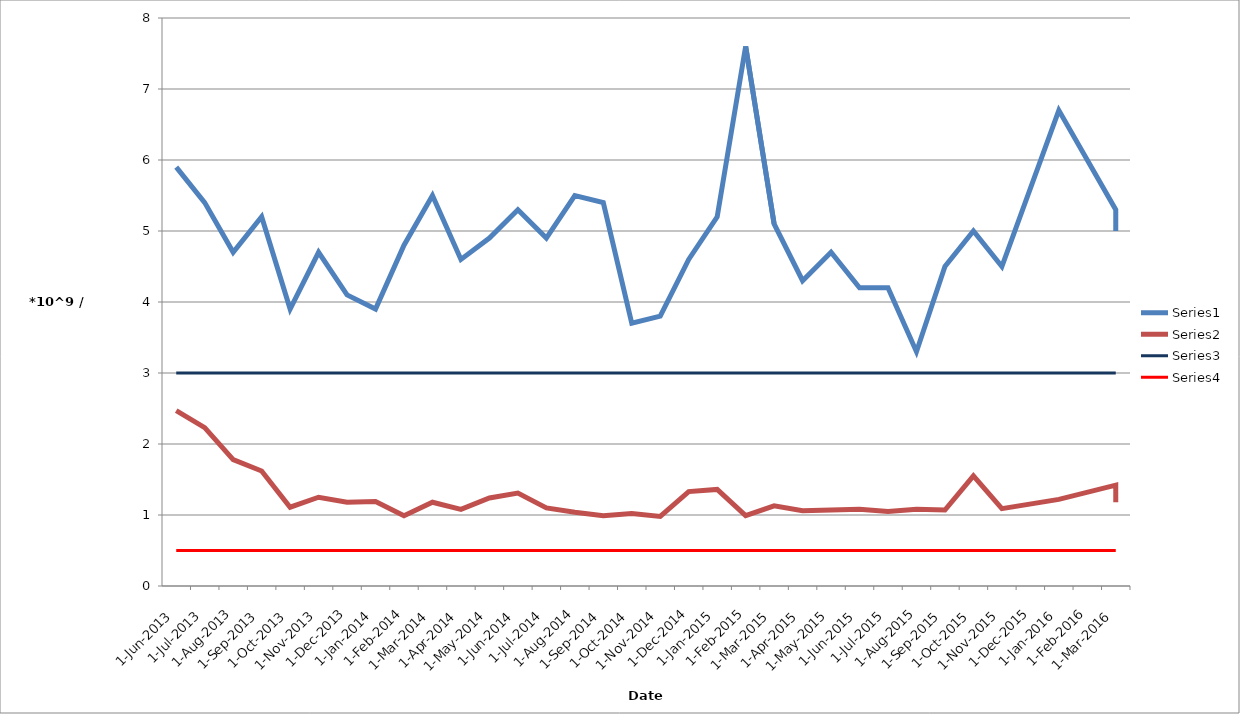
| Category | Series 0 | Series 1 | Series 2 | Series 3 |
|---|---|---|---|---|
| 2013-06-17 | 5.9 | 2.47 | 3 | 0.5 |
| 2013-07-19 | 5.4 | 2.23 | 3 | 0.5 |
| 2013-08-24 | 4.7 | 1.78 | 3 | 0.5 |
| 2013-09-30 | 5.2 | 1.62 | 3 | 0.5 |
| 2013-10-31 | 3.9 | 1.11 | 3 | 0.5 |
| 2013-11-29 | 4.7 | 1.25 | 3 | 0.5 |
| 2013-12-30 | 4.1 | 1.18 | 3 | 0.5 |
| 2014-01-27 | 3.9 | 1.19 | 3 | 0.5 |
| 2014-02-28 | 4.8 | 0.99 | 3 | 0.5 |
| 2014-03-28 | 5.5 | 1.18 | 3 | 0.5 |
| 2014-04-29 | 4.6 | 1.08 | 3 | 0.5 |
| 2014-05-27 | 4.9 | 1.24 | 3 | 0.5 |
| 2014-06-30 | 5.3 | 1.31 | 3 | 0.5 |
| 2014-07-30 | 4.9 | 1.1 | 3 | 0.5 |
| 2014-08-29 | 5.5 | 1.04 | 3 | 0.5 |
| 2014-09-30 | 5.4 | 0.99 | 3 | 0.5 |
| 2014-10-31 | 3.7 | 1.02 | 3 | 0.5 |
| 2014-11-30 | 3.8 | 0.98 | 3 | 0.5 |
| 2014-12-31 | 4.6 | 1.33 | 3 | 0.5 |
| 2015-01-31 | 5.2 | 1.36 | 3 | 0.5 |
| 2015-02-03 | 7.6 | 0.99 | 3 | 0.5 |
| 2015-03-30 | 5.1 | 1.13 | 3 | 0.5 |
| 2015-04-30 | 4.3 | 1.06 | 3 | 0.5 |
| 2015-05-30 | 4.7 | 1.07 | 3 | 0.5 |
| 2015-06-30 | 4.2 | 1.08 | 3 | 0.5 |
| 2015-07-30 | 4.2 | 1.05 | 3 | 0.5 |
| 2015-08-30 | 3.3 | 1.08 | 3 | 0.5 |
| 2015-09-29 | 4.5 | 1.07 | 3 | 0.5 |
| 2015-10-31 | 5 | 1.55 | 3 | 0.5 |
| 2015-11-30 | 4.5 | 1.09 | 3 | 0.5 |
| 2016-01-31 | 6.7 | 1.22 | 3 | 0.5 |
| 2016-03-14 | 5.3 | 1.42 | 3 | 0.5 |
| 2016-03-31 | 5 | 1.18 | 3 | 0.5 |